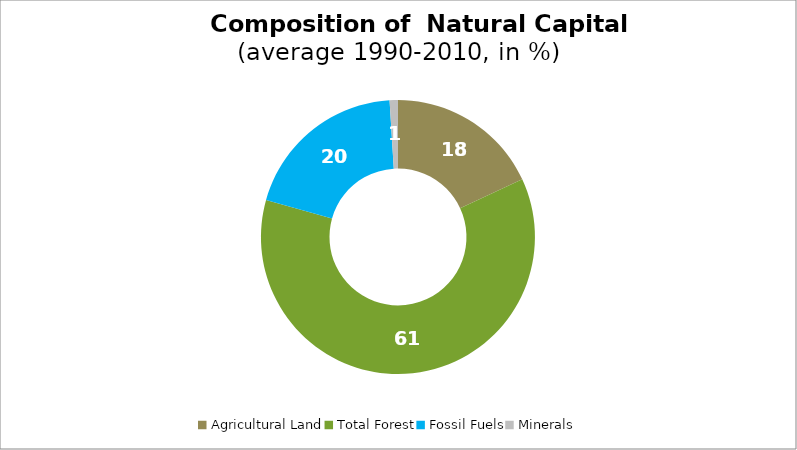
| Category | Series 0 |
|---|---|
| Agricultural Land | 18.075 |
| Total Forest | 61.265 |
| Fossil Fuels | 19.679 |
| Minerals | 0.981 |